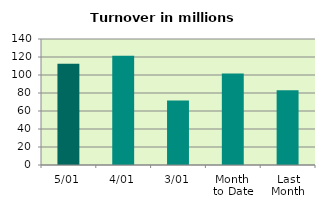
| Category | Series 0 |
|---|---|
| 5/01 | 112.413 |
| 4/01 | 121.421 |
| 3/01 | 71.565 |
| Month 
to Date | 101.8 |
| Last
Month | 83.19 |